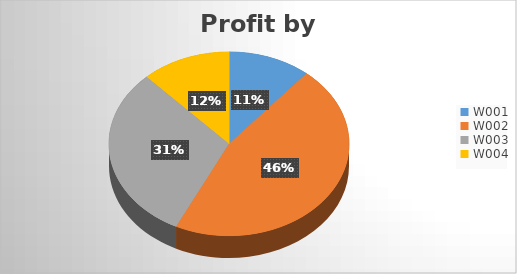
| Category | Total |
|---|---|
| W001 | 152 |
| W002 | 630 |
| W003 | 420 |
| W004 | 164 |